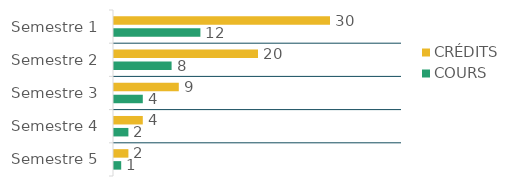
| Category | CRÉDITS  | COURS  |
|---|---|---|
| Semestre 1 | 30 | 12 |
| Semestre 2 | 20 | 8 |
| Semestre 3 | 9 | 4 |
| Semestre 4 | 4 | 2 |
| Semestre 5 | 2 | 1 |